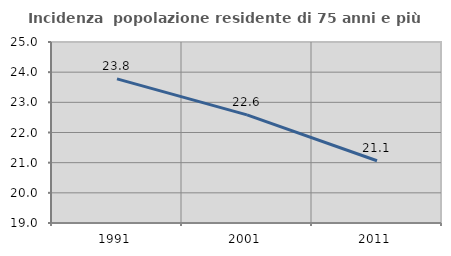
| Category | Incidenza  popolazione residente di 75 anni e più |
|---|---|
| 1991.0 | 23.778 |
| 2001.0 | 22.586 |
| 2011.0 | 21.063 |